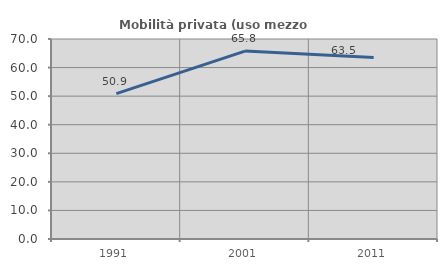
| Category | Mobilità privata (uso mezzo privato) |
|---|---|
| 1991.0 | 50.877 |
| 2001.0 | 65.759 |
| 2011.0 | 63.515 |